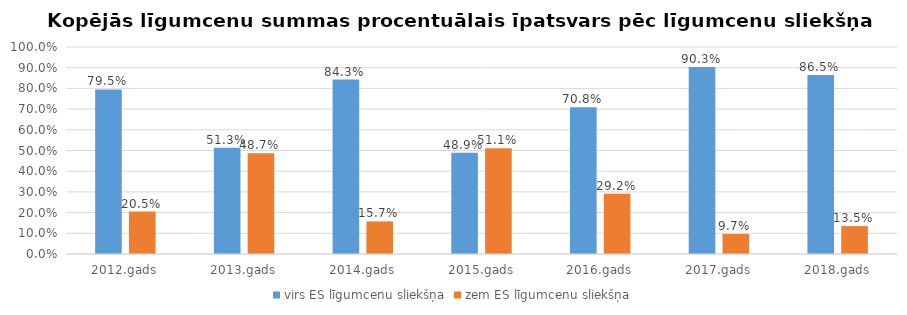
| Category | virs ES līgumcenu sliekšņa | zem ES līgumcenu sliekšņa |
|---|---|---|
| 2012.gads | 0.795 | 0.205 |
| 2013.gads | 0.513 | 0.487 |
| 2014.gads | 0.843 | 0.157 |
| 2015.gads | 0.489 | 0.511 |
| 2016.gads | 0.708 | 0.292 |
| 2017.gads | 0.903 | 0.097 |
| 2018.gads | 0.865 | 0.135 |